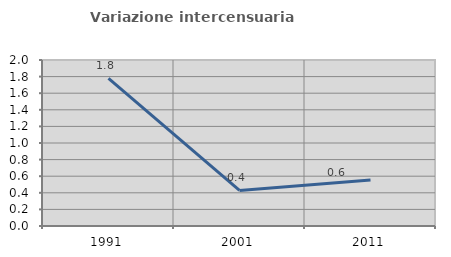
| Category | Variazione intercensuaria annua |
|---|---|
| 1991.0 | 1.778 |
| 2001.0 | 0.428 |
| 2011.0 | 0.555 |